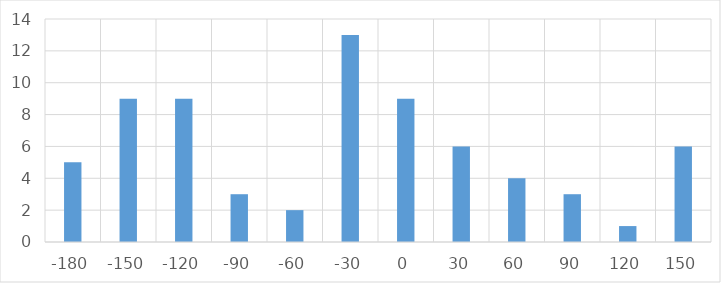
| Category | Series 0 |
|---|---|
| -180.0 | 5 |
| -150.0 | 9 |
| -120.0 | 9 |
| -90.0 | 3 |
| -60.0 | 2 |
| -30.0 | 13 |
| 0.0 | 9 |
| 30.0 | 6 |
| 60.0 | 4 |
| 90.0 | 3 |
| 120.0 | 1 |
| 150.0 | 6 |